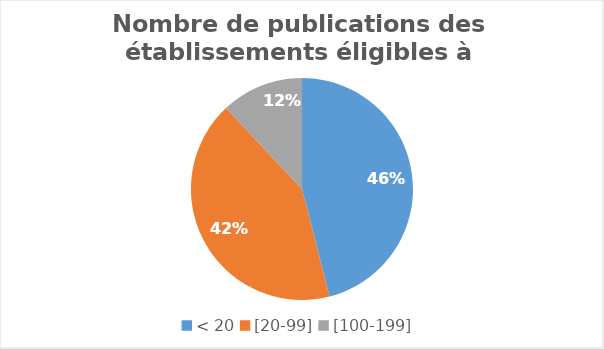
| Category | Series 0 |
|---|---|
| < 20 | 23 |
| [20-99] | 21 |
| [100-199] | 6 |